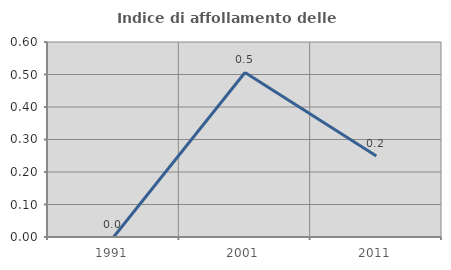
| Category | Indice di affollamento delle abitazioni  |
|---|---|
| 1991.0 | 0 |
| 2001.0 | 0.506 |
| 2011.0 | 0.249 |